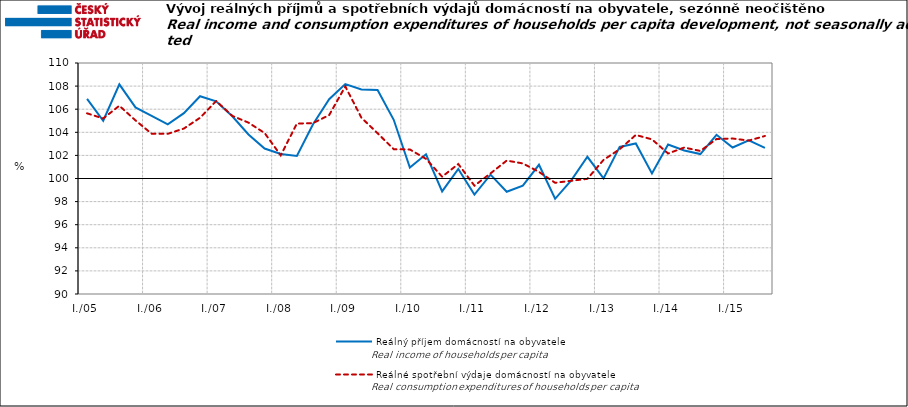
| Category | Reálný příjem domácností na obyvatele | Reálné spotřební výdaje domácností na obyvatele |
|---|---|---|
| I./05 | 106.898 | 105.642 |
|  | 104.998 | 105.199 |
|  | 108.15 | 106.3 |
|  | 106.155 | 105.031 |
| I./06 | 105.431 | 103.879 |
|  | 104.685 | 103.87 |
|  | 105.658 | 104.326 |
|  | 107.121 | 105.256 |
| I./07 | 106.684 | 106.711 |
|  | 105.383 | 105.42 |
|  | 103.807 | 104.837 |
|  | 102.598 | 103.939 |
| I./08 | 102.123 | 102.003 |
|  | 101.955 | 104.757 |
|  | 104.7 | 104.794 |
|  | 106.862 | 105.492 |
| I./09 | 108.173 | 107.97 |
|  | 107.713 | 105.261 |
|  | 107.657 | 103.919 |
|  | 105.084 | 102.535 |
| I./10 | 100.941 | 102.513 |
|  | 102.091 | 101.699 |
|  | 98.879 | 100.155 |
|  | 100.825 | 101.253 |
| I./11 | 98.606 | 99.379 |
|  | 100.332 | 100.444 |
|  | 98.849 | 101.552 |
|  | 99.386 | 101.305 |
| I./12 | 101.189 | 100.571 |
|  | 98.242 | 99.628 |
|  | 99.844 | 99.805 |
|  | 101.878 | 99.972 |
| I./13 | 100.014 | 101.61 |
|  | 102.735 | 102.534 |
|  | 103.03 | 103.769 |
|  | 100.433 | 103.39 |
| I./14 | 102.938 | 102.164 |
|  | 102.425 | 102.681 |
|  | 102.116 | 102.384 |
|  | 103.781 | 103.423 |
| I./15 | 102.684 | 103.462 |